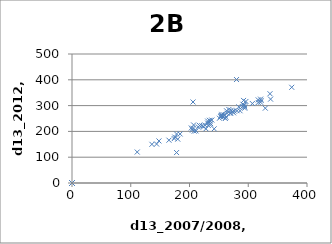
| Category | Series 0 |
|---|---|
| 271.0 | 282 |
| 232.0 | 223 |
| 178.0 | 190 |
| 276.0 | 279 |
| 148.0 | 163 |
| 294.0 | 295 |
| 254.0 | 260 |
| 144.0 | 151 |
| 338.0 | 325 |
| 238.0 | 244 |
| 175.0 | 178 |
| 136.0 | 150 |
| 207.0 | 225 |
| 0.0 | 0 |
| 231.0 | 240 |
| 221.0 | 222 |
| 0.0 | 0 |
| 231.0 | 232 |
| 174.0 | 172 |
| 234.0 | 243 |
| 264.0 | 270 |
| 270.0 | 271 |
| 206.0 | 212 |
| 165.0 | 166 |
| 317.0 | 322 |
| 291.0 | 305 |
| 180.0 | 170 |
| 215.0 | 217 |
| 296.0 | 316 |
| 292.0 | 320 |
| 329.0 | 290 |
| 0.0 | 0 |
| 263.0 | 280 |
| 242.0 | 210 |
| 294.0 | 290 |
| 259.0 | 263 |
| 307.0 | 308 |
| 284.0 | 295 |
| 269.0 | 270 |
| 235.0 | 240 |
| 253.0 | 257 |
| 374.0 | 371 |
| 211.0 | 202 |
| 0.0 | 0 |
| 255.0 | 260 |
| 290.0 | 296 |
| 321.0 | 313 |
| 321.0 | 325 |
| 286.0 | 280 |
| 260.0 | 263 |
| 203.0 | 213 |
| 257.0 | 256 |
| 262.0 | 255 |
| 184.0 | 190 |
| 0.0 | 0 |
| 0.0 | 0 |
| 255.0 | 266 |
| 226.0 | 225 |
| 261.0 | 250 |
| 281.0 | 280 |
| 317.0 | 312 |
| 293.0 | 301 |
| 0.0 | 0 |
| 293.0 | 302 |
| 206.0 | 314 |
| 322.0 | 320 |
| 280.0 | 401 |
| 255.0 | 262 |
| 208.0 | 201 |
| 251.0 | 251 |
| 267.0 | 285 |
| 337.0 | 346 |
| 228.0 | 210 |
| 234.0 | 228 |
| 205.0 | 205 |
| 0.0 | 0 |
| 275.0 | 272 |
| 236.0 | 230 |
| 273.0 | 277 |
| 178.0 | 118 |
| 111.0 | 120 |
| 0.0 | 0 |
| 217.0 | 223 |
| 224.0 | 218 |
| 0.0 | 0 |
| 0.0 | 0 |
| 0.0 | 0 |
| 0.0 | 0 |
| 0.0 | 0 |
| 0.0 | 0 |
| 0.0 | 0 |